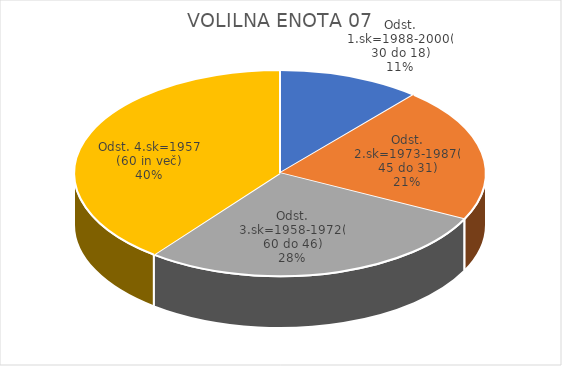
| Category | VOLILNA ENOTA 07 |
|---|---|
| Odst. 1.sk=1988-2000(30 do 18) | 5.52 |
| Odst. 2.sk=1973-1987(45 do 31) | 10.36 |
| Odst. 3.sk=1958-1972(60 do 46) | 13.78 |
| Odst. 4.sk=1957 (60 in več) | 19.38 |